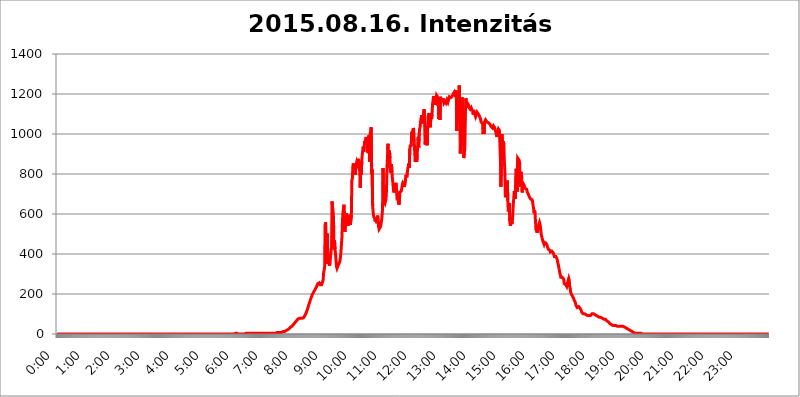
| Category | 2015.08.16. Intenzitás [W/m^2] |
|---|---|
| 0.0 | 0 |
| 0.0006944444444444445 | 0 |
| 0.001388888888888889 | 0 |
| 0.0020833333333333333 | 0 |
| 0.002777777777777778 | 0 |
| 0.003472222222222222 | 0 |
| 0.004166666666666667 | 0 |
| 0.004861111111111111 | 0 |
| 0.005555555555555556 | 0 |
| 0.0062499999999999995 | 0 |
| 0.006944444444444444 | 0 |
| 0.007638888888888889 | 0 |
| 0.008333333333333333 | 0 |
| 0.009027777777777779 | 0 |
| 0.009722222222222222 | 0 |
| 0.010416666666666666 | 0 |
| 0.011111111111111112 | 0 |
| 0.011805555555555555 | 0 |
| 0.012499999999999999 | 0 |
| 0.013194444444444444 | 0 |
| 0.013888888888888888 | 0 |
| 0.014583333333333332 | 0 |
| 0.015277777777777777 | 0 |
| 0.015972222222222224 | 0 |
| 0.016666666666666666 | 0 |
| 0.017361111111111112 | 0 |
| 0.018055555555555557 | 0 |
| 0.01875 | 0 |
| 0.019444444444444445 | 0 |
| 0.02013888888888889 | 0 |
| 0.020833333333333332 | 0 |
| 0.02152777777777778 | 0 |
| 0.022222222222222223 | 0 |
| 0.02291666666666667 | 0 |
| 0.02361111111111111 | 0 |
| 0.024305555555555556 | 0 |
| 0.024999999999999998 | 0 |
| 0.025694444444444447 | 0 |
| 0.02638888888888889 | 0 |
| 0.027083333333333334 | 0 |
| 0.027777777777777776 | 0 |
| 0.02847222222222222 | 0 |
| 0.029166666666666664 | 0 |
| 0.029861111111111113 | 0 |
| 0.030555555555555555 | 0 |
| 0.03125 | 0 |
| 0.03194444444444445 | 0 |
| 0.03263888888888889 | 0 |
| 0.03333333333333333 | 0 |
| 0.034027777777777775 | 0 |
| 0.034722222222222224 | 0 |
| 0.035416666666666666 | 0 |
| 0.036111111111111115 | 0 |
| 0.03680555555555556 | 0 |
| 0.0375 | 0 |
| 0.03819444444444444 | 0 |
| 0.03888888888888889 | 0 |
| 0.03958333333333333 | 0 |
| 0.04027777777777778 | 0 |
| 0.04097222222222222 | 0 |
| 0.041666666666666664 | 0 |
| 0.042361111111111106 | 0 |
| 0.04305555555555556 | 0 |
| 0.043750000000000004 | 0 |
| 0.044444444444444446 | 0 |
| 0.04513888888888889 | 0 |
| 0.04583333333333334 | 0 |
| 0.04652777777777778 | 0 |
| 0.04722222222222222 | 0 |
| 0.04791666666666666 | 0 |
| 0.04861111111111111 | 0 |
| 0.049305555555555554 | 0 |
| 0.049999999999999996 | 0 |
| 0.05069444444444445 | 0 |
| 0.051388888888888894 | 0 |
| 0.052083333333333336 | 0 |
| 0.05277777777777778 | 0 |
| 0.05347222222222222 | 0 |
| 0.05416666666666667 | 0 |
| 0.05486111111111111 | 0 |
| 0.05555555555555555 | 0 |
| 0.05625 | 0 |
| 0.05694444444444444 | 0 |
| 0.057638888888888885 | 0 |
| 0.05833333333333333 | 0 |
| 0.05902777777777778 | 0 |
| 0.059722222222222225 | 0 |
| 0.06041666666666667 | 0 |
| 0.061111111111111116 | 0 |
| 0.06180555555555556 | 0 |
| 0.0625 | 0 |
| 0.06319444444444444 | 0 |
| 0.06388888888888888 | 0 |
| 0.06458333333333334 | 0 |
| 0.06527777777777778 | 0 |
| 0.06597222222222222 | 0 |
| 0.06666666666666667 | 0 |
| 0.06736111111111111 | 0 |
| 0.06805555555555555 | 0 |
| 0.06874999999999999 | 0 |
| 0.06944444444444443 | 0 |
| 0.07013888888888889 | 0 |
| 0.07083333333333333 | 0 |
| 0.07152777777777779 | 0 |
| 0.07222222222222223 | 0 |
| 0.07291666666666667 | 0 |
| 0.07361111111111111 | 0 |
| 0.07430555555555556 | 0 |
| 0.075 | 0 |
| 0.07569444444444444 | 0 |
| 0.0763888888888889 | 0 |
| 0.07708333333333334 | 0 |
| 0.07777777777777778 | 0 |
| 0.07847222222222222 | 0 |
| 0.07916666666666666 | 0 |
| 0.0798611111111111 | 0 |
| 0.08055555555555556 | 0 |
| 0.08125 | 0 |
| 0.08194444444444444 | 0 |
| 0.08263888888888889 | 0 |
| 0.08333333333333333 | 0 |
| 0.08402777777777777 | 0 |
| 0.08472222222222221 | 0 |
| 0.08541666666666665 | 0 |
| 0.08611111111111112 | 0 |
| 0.08680555555555557 | 0 |
| 0.08750000000000001 | 0 |
| 0.08819444444444445 | 0 |
| 0.08888888888888889 | 0 |
| 0.08958333333333333 | 0 |
| 0.09027777777777778 | 0 |
| 0.09097222222222222 | 0 |
| 0.09166666666666667 | 0 |
| 0.09236111111111112 | 0 |
| 0.09305555555555556 | 0 |
| 0.09375 | 0 |
| 0.09444444444444444 | 0 |
| 0.09513888888888888 | 0 |
| 0.09583333333333333 | 0 |
| 0.09652777777777777 | 0 |
| 0.09722222222222222 | 0 |
| 0.09791666666666667 | 0 |
| 0.09861111111111111 | 0 |
| 0.09930555555555555 | 0 |
| 0.09999999999999999 | 0 |
| 0.10069444444444443 | 0 |
| 0.1013888888888889 | 0 |
| 0.10208333333333335 | 0 |
| 0.10277777777777779 | 0 |
| 0.10347222222222223 | 0 |
| 0.10416666666666667 | 0 |
| 0.10486111111111111 | 0 |
| 0.10555555555555556 | 0 |
| 0.10625 | 0 |
| 0.10694444444444444 | 0 |
| 0.1076388888888889 | 0 |
| 0.10833333333333334 | 0 |
| 0.10902777777777778 | 0 |
| 0.10972222222222222 | 0 |
| 0.1111111111111111 | 0 |
| 0.11180555555555556 | 0 |
| 0.11180555555555556 | 0 |
| 0.1125 | 0 |
| 0.11319444444444444 | 0 |
| 0.11388888888888889 | 0 |
| 0.11458333333333333 | 0 |
| 0.11527777777777777 | 0 |
| 0.11597222222222221 | 0 |
| 0.11666666666666665 | 0 |
| 0.1173611111111111 | 0 |
| 0.11805555555555557 | 0 |
| 0.11944444444444445 | 0 |
| 0.12013888888888889 | 0 |
| 0.12083333333333333 | 0 |
| 0.12152777777777778 | 0 |
| 0.12222222222222223 | 0 |
| 0.12291666666666667 | 0 |
| 0.12291666666666667 | 0 |
| 0.12361111111111112 | 0 |
| 0.12430555555555556 | 0 |
| 0.125 | 0 |
| 0.12569444444444444 | 0 |
| 0.12638888888888888 | 0 |
| 0.12708333333333333 | 0 |
| 0.16875 | 0 |
| 0.12847222222222224 | 0 |
| 0.12916666666666668 | 0 |
| 0.12986111111111112 | 0 |
| 0.13055555555555556 | 0 |
| 0.13125 | 0 |
| 0.13194444444444445 | 0 |
| 0.1326388888888889 | 0 |
| 0.13333333333333333 | 0 |
| 0.13402777777777777 | 0 |
| 0.13402777777777777 | 0 |
| 0.13472222222222222 | 0 |
| 0.13541666666666666 | 0 |
| 0.1361111111111111 | 0 |
| 0.13749999999999998 | 0 |
| 0.13819444444444443 | 0 |
| 0.1388888888888889 | 0 |
| 0.13958333333333334 | 0 |
| 0.14027777777777778 | 0 |
| 0.14097222222222222 | 0 |
| 0.14166666666666666 | 0 |
| 0.1423611111111111 | 0 |
| 0.14305555555555557 | 0 |
| 0.14375000000000002 | 0 |
| 0.14444444444444446 | 0 |
| 0.1451388888888889 | 0 |
| 0.1451388888888889 | 0 |
| 0.14652777777777778 | 0 |
| 0.14722222222222223 | 0 |
| 0.14791666666666667 | 0 |
| 0.1486111111111111 | 0 |
| 0.14930555555555555 | 0 |
| 0.15 | 0 |
| 0.15069444444444444 | 0 |
| 0.15138888888888888 | 0 |
| 0.15208333333333332 | 0 |
| 0.15277777777777776 | 0 |
| 0.15347222222222223 | 0 |
| 0.15416666666666667 | 0 |
| 0.15486111111111112 | 0 |
| 0.15555555555555556 | 0 |
| 0.15625 | 0 |
| 0.15694444444444444 | 0 |
| 0.15763888888888888 | 0 |
| 0.15833333333333333 | 0 |
| 0.15902777777777777 | 0 |
| 0.15972222222222224 | 0 |
| 0.16041666666666668 | 0 |
| 0.16111111111111112 | 0 |
| 0.16180555555555556 | 0 |
| 0.1625 | 0 |
| 0.16319444444444445 | 0 |
| 0.1638888888888889 | 0 |
| 0.16458333333333333 | 0 |
| 0.16527777777777777 | 0 |
| 0.16597222222222222 | 0 |
| 0.16666666666666666 | 0 |
| 0.1673611111111111 | 0 |
| 0.16805555555555554 | 0 |
| 0.16874999999999998 | 0 |
| 0.16944444444444443 | 0 |
| 0.17013888888888887 | 0 |
| 0.1708333333333333 | 0 |
| 0.17152777777777775 | 0 |
| 0.17222222222222225 | 0 |
| 0.1729166666666667 | 0 |
| 0.17361111111111113 | 0 |
| 0.17430555555555557 | 0 |
| 0.17500000000000002 | 0 |
| 0.17569444444444446 | 0 |
| 0.1763888888888889 | 0 |
| 0.17708333333333334 | 0 |
| 0.17777777777777778 | 0 |
| 0.17847222222222223 | 0 |
| 0.17916666666666667 | 0 |
| 0.1798611111111111 | 0 |
| 0.18055555555555555 | 0 |
| 0.18125 | 0 |
| 0.18194444444444444 | 0 |
| 0.1826388888888889 | 0 |
| 0.18333333333333335 | 0 |
| 0.1840277777777778 | 0 |
| 0.18472222222222223 | 0 |
| 0.18541666666666667 | 0 |
| 0.18611111111111112 | 0 |
| 0.18680555555555556 | 0 |
| 0.1875 | 0 |
| 0.18819444444444444 | 0 |
| 0.18888888888888888 | 0 |
| 0.18958333333333333 | 0 |
| 0.19027777777777777 | 0 |
| 0.1909722222222222 | 0 |
| 0.19166666666666665 | 0 |
| 0.19236111111111112 | 0 |
| 0.19305555555555554 | 0 |
| 0.19375 | 0 |
| 0.19444444444444445 | 0 |
| 0.1951388888888889 | 0 |
| 0.19583333333333333 | 0 |
| 0.19652777777777777 | 0 |
| 0.19722222222222222 | 0 |
| 0.19791666666666666 | 0 |
| 0.1986111111111111 | 0 |
| 0.19930555555555554 | 0 |
| 0.19999999999999998 | 0 |
| 0.20069444444444443 | 0 |
| 0.20138888888888887 | 0 |
| 0.2020833333333333 | 0 |
| 0.2027777777777778 | 0 |
| 0.2034722222222222 | 0 |
| 0.2041666666666667 | 0 |
| 0.20486111111111113 | 0 |
| 0.20555555555555557 | 0 |
| 0.20625000000000002 | 0 |
| 0.20694444444444446 | 0 |
| 0.2076388888888889 | 0 |
| 0.20833333333333334 | 0 |
| 0.20902777777777778 | 0 |
| 0.20972222222222223 | 0 |
| 0.21041666666666667 | 0 |
| 0.2111111111111111 | 0 |
| 0.21180555555555555 | 0 |
| 0.2125 | 0 |
| 0.21319444444444444 | 0 |
| 0.2138888888888889 | 0 |
| 0.21458333333333335 | 0 |
| 0.2152777777777778 | 0 |
| 0.21597222222222223 | 0 |
| 0.21666666666666667 | 0 |
| 0.21736111111111112 | 0 |
| 0.21805555555555556 | 0 |
| 0.21875 | 0 |
| 0.21944444444444444 | 0 |
| 0.22013888888888888 | 0 |
| 0.22083333333333333 | 0 |
| 0.22152777777777777 | 0 |
| 0.2222222222222222 | 0 |
| 0.22291666666666665 | 0 |
| 0.2236111111111111 | 0 |
| 0.22430555555555556 | 0 |
| 0.225 | 0 |
| 0.22569444444444445 | 0 |
| 0.2263888888888889 | 0 |
| 0.22708333333333333 | 0 |
| 0.22777777777777777 | 0 |
| 0.22847222222222222 | 0 |
| 0.22916666666666666 | 0 |
| 0.2298611111111111 | 0 |
| 0.23055555555555554 | 0 |
| 0.23124999999999998 | 0 |
| 0.23194444444444443 | 0 |
| 0.23263888888888887 | 0 |
| 0.2333333333333333 | 0 |
| 0.2340277777777778 | 0 |
| 0.2347222222222222 | 0 |
| 0.2354166666666667 | 0 |
| 0.23611111111111113 | 0 |
| 0.23680555555555557 | 0 |
| 0.23750000000000002 | 0 |
| 0.23819444444444446 | 0 |
| 0.2388888888888889 | 0 |
| 0.23958333333333334 | 0 |
| 0.24027777777777778 | 0 |
| 0.24097222222222223 | 0 |
| 0.24166666666666667 | 0 |
| 0.2423611111111111 | 0 |
| 0.24305555555555555 | 0 |
| 0.24375 | 0 |
| 0.24444444444444446 | 0 |
| 0.24513888888888888 | 0 |
| 0.24583333333333335 | 0 |
| 0.2465277777777778 | 0 |
| 0.24722222222222223 | 0 |
| 0.24791666666666667 | 0 |
| 0.24861111111111112 | 0 |
| 0.24930555555555556 | 0 |
| 0.25 | 3.525 |
| 0.25069444444444444 | 3.525 |
| 0.2513888888888889 | 0 |
| 0.2520833333333333 | 3.525 |
| 0.25277777777777777 | 0 |
| 0.2534722222222222 | 0 |
| 0.25416666666666665 | 0 |
| 0.2548611111111111 | 0 |
| 0.2555555555555556 | 0 |
| 0.25625000000000003 | 0 |
| 0.2569444444444445 | 3.525 |
| 0.2576388888888889 | 0 |
| 0.25833333333333336 | 0 |
| 0.2590277777777778 | 0 |
| 0.25972222222222224 | 0 |
| 0.2604166666666667 | 0 |
| 0.2611111111111111 | 0 |
| 0.26180555555555557 | 0 |
| 0.2625 | 0 |
| 0.26319444444444445 | 0 |
| 0.2638888888888889 | 0 |
| 0.26458333333333334 | 3.525 |
| 0.2652777777777778 | 3.525 |
| 0.2659722222222222 | 3.525 |
| 0.26666666666666666 | 3.525 |
| 0.2673611111111111 | 3.525 |
| 0.26805555555555555 | 3.525 |
| 0.26875 | 3.525 |
| 0.26944444444444443 | 3.525 |
| 0.2701388888888889 | 3.525 |
| 0.2708333333333333 | 3.525 |
| 0.27152777777777776 | 3.525 |
| 0.2722222222222222 | 3.525 |
| 0.27291666666666664 | 3.525 |
| 0.2736111111111111 | 3.525 |
| 0.2743055555555555 | 3.525 |
| 0.27499999999999997 | 3.525 |
| 0.27569444444444446 | 3.525 |
| 0.27638888888888885 | 3.525 |
| 0.27708333333333335 | 3.525 |
| 0.2777777777777778 | 3.525 |
| 0.27847222222222223 | 3.525 |
| 0.2791666666666667 | 3.525 |
| 0.2798611111111111 | 3.525 |
| 0.28055555555555556 | 3.525 |
| 0.28125 | 3.525 |
| 0.28194444444444444 | 3.525 |
| 0.2826388888888889 | 3.525 |
| 0.2833333333333333 | 3.525 |
| 0.28402777777777777 | 3.525 |
| 0.2847222222222222 | 3.525 |
| 0.28541666666666665 | 3.525 |
| 0.28611111111111115 | 3.525 |
| 0.28680555555555554 | 3.525 |
| 0.28750000000000003 | 3.525 |
| 0.2881944444444445 | 3.525 |
| 0.2888888888888889 | 3.525 |
| 0.28958333333333336 | 3.525 |
| 0.2902777777777778 | 3.525 |
| 0.29097222222222224 | 3.525 |
| 0.2916666666666667 | 3.525 |
| 0.2923611111111111 | 3.525 |
| 0.29305555555555557 | 3.525 |
| 0.29375 | 3.525 |
| 0.29444444444444445 | 3.525 |
| 0.2951388888888889 | 3.525 |
| 0.29583333333333334 | 3.525 |
| 0.2965277777777778 | 3.525 |
| 0.2972222222222222 | 3.525 |
| 0.29791666666666666 | 3.525 |
| 0.2986111111111111 | 3.525 |
| 0.29930555555555555 | 3.525 |
| 0.3 | 3.525 |
| 0.30069444444444443 | 3.525 |
| 0.3013888888888889 | 3.525 |
| 0.3020833333333333 | 3.525 |
| 0.30277777777777776 | 3.525 |
| 0.3034722222222222 | 3.525 |
| 0.30416666666666664 | 3.525 |
| 0.3048611111111111 | 3.525 |
| 0.3055555555555555 | 3.525 |
| 0.30624999999999997 | 3.525 |
| 0.3069444444444444 | 3.525 |
| 0.3076388888888889 | 7.887 |
| 0.30833333333333335 | 7.887 |
| 0.3090277777777778 | 7.887 |
| 0.30972222222222223 | 7.887 |
| 0.3104166666666667 | 7.887 |
| 0.3111111111111111 | 7.887 |
| 0.31180555555555556 | 7.887 |
| 0.3125 | 7.887 |
| 0.31319444444444444 | 7.887 |
| 0.3138888888888889 | 7.887 |
| 0.3145833333333333 | 7.887 |
| 0.31527777777777777 | 7.887 |
| 0.3159722222222222 | 12.257 |
| 0.31666666666666665 | 12.257 |
| 0.31736111111111115 | 12.257 |
| 0.31805555555555554 | 12.257 |
| 0.31875000000000003 | 12.257 |
| 0.3194444444444445 | 12.257 |
| 0.3201388888888889 | 16.636 |
| 0.32083333333333336 | 16.636 |
| 0.3215277777777778 | 21.024 |
| 0.32222222222222224 | 21.024 |
| 0.3229166666666667 | 21.024 |
| 0.3236111111111111 | 21.024 |
| 0.32430555555555557 | 25.419 |
| 0.325 | 25.419 |
| 0.32569444444444445 | 29.823 |
| 0.3263888888888889 | 29.823 |
| 0.32708333333333334 | 34.234 |
| 0.3277777777777778 | 34.234 |
| 0.3284722222222222 | 38.653 |
| 0.32916666666666666 | 38.653 |
| 0.3298611111111111 | 38.653 |
| 0.33055555555555555 | 43.079 |
| 0.33125 | 47.511 |
| 0.33194444444444443 | 47.511 |
| 0.3326388888888889 | 51.951 |
| 0.3333333333333333 | 56.398 |
| 0.3340277777777778 | 60.85 |
| 0.3347222222222222 | 60.85 |
| 0.3354166666666667 | 65.31 |
| 0.3361111111111111 | 65.31 |
| 0.3368055555555556 | 69.775 |
| 0.33749999999999997 | 74.246 |
| 0.33819444444444446 | 74.246 |
| 0.33888888888888885 | 78.722 |
| 0.33958333333333335 | 78.722 |
| 0.34027777777777773 | 78.722 |
| 0.34097222222222223 | 78.722 |
| 0.3416666666666666 | 78.722 |
| 0.3423611111111111 | 78.722 |
| 0.3430555555555555 | 78.722 |
| 0.34375 | 78.722 |
| 0.3444444444444445 | 78.722 |
| 0.3451388888888889 | 83.205 |
| 0.3458333333333334 | 83.205 |
| 0.34652777777777777 | 87.692 |
| 0.34722222222222227 | 92.184 |
| 0.34791666666666665 | 96.682 |
| 0.34861111111111115 | 101.184 |
| 0.34930555555555554 | 105.69 |
| 0.35000000000000003 | 114.716 |
| 0.3506944444444444 | 119.235 |
| 0.3513888888888889 | 128.284 |
| 0.3520833333333333 | 137.347 |
| 0.3527777777777778 | 146.423 |
| 0.3534722222222222 | 150.964 |
| 0.3541666666666667 | 160.056 |
| 0.3548611111111111 | 169.156 |
| 0.35555555555555557 | 173.709 |
| 0.35625 | 182.82 |
| 0.35694444444444445 | 187.378 |
| 0.3576388888888889 | 196.497 |
| 0.35833333333333334 | 201.058 |
| 0.3590277777777778 | 205.62 |
| 0.3597222222222222 | 210.182 |
| 0.36041666666666666 | 214.746 |
| 0.3611111111111111 | 219.309 |
| 0.36180555555555555 | 219.309 |
| 0.3625 | 228.436 |
| 0.36319444444444443 | 233 |
| 0.3638888888888889 | 237.564 |
| 0.3645833333333333 | 242.127 |
| 0.3652777777777778 | 251.251 |
| 0.3659722222222222 | 251.251 |
| 0.3666666666666667 | 255.813 |
| 0.3673611111111111 | 255.813 |
| 0.3680555555555556 | 251.251 |
| 0.36874999999999997 | 246.689 |
| 0.36944444444444446 | 246.689 |
| 0.37013888888888885 | 246.689 |
| 0.37083333333333335 | 246.689 |
| 0.37152777777777773 | 255.813 |
| 0.37222222222222223 | 260.373 |
| 0.3729166666666666 | 269.49 |
| 0.3736111111111111 | 305.898 |
| 0.3743055555555555 | 310.44 |
| 0.375 | 333.113 |
| 0.3756944444444445 | 545.416 |
| 0.3763888888888889 | 558.261 |
| 0.3770833333333334 | 382.715 |
| 0.37777777777777777 | 351.198 |
| 0.37847222222222227 | 502.192 |
| 0.37916666666666665 | 431.833 |
| 0.37986111111111115 | 396.164 |
| 0.38055555555555554 | 355.712 |
| 0.38125000000000003 | 360.221 |
| 0.3819444444444444 | 342.162 |
| 0.3826388888888889 | 360.221 |
| 0.3833333333333333 | 391.685 |
| 0.3840277777777778 | 396.164 |
| 0.3847222222222222 | 436.27 |
| 0.3854166666666667 | 663.019 |
| 0.3861111111111111 | 634.105 |
| 0.38680555555555557 | 617.436 |
| 0.3875 | 575.299 |
| 0.38819444444444445 | 422.943 |
| 0.3888888888888889 | 467.187 |
| 0.38958333333333334 | 422.943 |
| 0.3902777777777778 | 400.638 |
| 0.3909722222222222 | 369.23 |
| 0.39166666666666666 | 337.639 |
| 0.3923611111111111 | 328.584 |
| 0.39305555555555555 | 333.113 |
| 0.39375 | 342.162 |
| 0.39444444444444443 | 346.682 |
| 0.3951388888888889 | 351.198 |
| 0.3958333333333333 | 355.712 |
| 0.3965277777777778 | 364.728 |
| 0.3972222222222222 | 387.202 |
| 0.3979166666666667 | 409.574 |
| 0.3986111111111111 | 449.551 |
| 0.3993055555555556 | 484.735 |
| 0.39999999999999997 | 562.53 |
| 0.40069444444444446 | 609.062 |
| 0.40138888888888885 | 621.613 |
| 0.40208333333333335 | 646.537 |
| 0.40277777777777773 | 562.53 |
| 0.40347222222222223 | 510.885 |
| 0.4041666666666666 | 515.223 |
| 0.4048611111111111 | 592.233 |
| 0.4055555555555555 | 604.864 |
| 0.40625 | 549.704 |
| 0.4069444444444445 | 571.049 |
| 0.4076388888888889 | 541.121 |
| 0.4083333333333334 | 575.299 |
| 0.40902777777777777 | 571.049 |
| 0.40972222222222227 | 596.45 |
| 0.41041666666666665 | 553.986 |
| 0.41111111111111115 | 545.416 |
| 0.41180555555555554 | 549.704 |
| 0.41250000000000003 | 596.45 |
| 0.4131944444444444 | 767.62 |
| 0.4138888888888889 | 775.492 |
| 0.4145833333333333 | 837.682 |
| 0.4152777777777778 | 853.029 |
| 0.4159722222222222 | 849.199 |
| 0.4166666666666667 | 806.757 |
| 0.4173611111111111 | 814.519 |
| 0.41805555555555557 | 795.074 |
| 0.41875 | 837.682 |
| 0.41944444444444445 | 849.199 |
| 0.4201388888888889 | 860.676 |
| 0.42083333333333334 | 853.029 |
| 0.4215277777777778 | 856.855 |
| 0.4222222222222222 | 875.918 |
| 0.42291666666666666 | 875.918 |
| 0.4236111111111111 | 837.682 |
| 0.42430555555555555 | 806.757 |
| 0.425 | 731.896 |
| 0.42569444444444443 | 829.981 |
| 0.4263888888888889 | 795.074 |
| 0.4270833333333333 | 864.493 |
| 0.4277777777777778 | 898.668 |
| 0.4284722222222222 | 902.447 |
| 0.4291666666666667 | 936.33 |
| 0.4298611111111111 | 909.996 |
| 0.4305555555555556 | 936.33 |
| 0.43124999999999997 | 966.295 |
| 0.43194444444444446 | 958.814 |
| 0.43263888888888885 | 962.555 |
| 0.43333333333333335 | 984.98 |
| 0.43402777777777773 | 973.772 |
| 0.43472222222222223 | 951.327 |
| 0.4354166666666666 | 906.223 |
| 0.4361111111111111 | 906.223 |
| 0.4368055555555555 | 992.448 |
| 0.4375 | 992.448 |
| 0.4381944444444445 | 860.676 |
| 0.4388888888888889 | 1003.65 |
| 0.4395833333333334 | 1011.118 |
| 0.44027777777777777 | 1033.537 |
| 0.44097222222222227 | 798.974 |
| 0.44166666666666665 | 822.26 |
| 0.44236111111111115 | 642.4 |
| 0.44305555555555554 | 609.062 |
| 0.44375000000000003 | 588.009 |
| 0.4444444444444444 | 592.233 |
| 0.4451388888888889 | 579.542 |
| 0.4458333333333333 | 562.53 |
| 0.4465277777777778 | 566.793 |
| 0.4472222222222222 | 579.542 |
| 0.4479166666666667 | 553.986 |
| 0.4486111111111111 | 562.53 |
| 0.44930555555555557 | 592.233 |
| 0.45 | 566.793 |
| 0.45069444444444445 | 536.82 |
| 0.4513888888888889 | 523.88 |
| 0.45208333333333334 | 523.88 |
| 0.4527777777777778 | 528.2 |
| 0.4534722222222222 | 536.82 |
| 0.45416666666666666 | 549.704 |
| 0.4548611111111111 | 566.793 |
| 0.45555555555555555 | 592.233 |
| 0.45625 | 625.784 |
| 0.45694444444444443 | 829.981 |
| 0.4576388888888889 | 646.537 |
| 0.4583333333333333 | 667.123 |
| 0.4590277777777778 | 671.22 |
| 0.4597222222222222 | 654.791 |
| 0.4604166666666667 | 654.791 |
| 0.4611111111111111 | 675.311 |
| 0.4618055555555556 | 719.877 |
| 0.46249999999999997 | 837.682 |
| 0.46319444444444446 | 883.516 |
| 0.46388888888888885 | 951.327 |
| 0.46458333333333335 | 829.981 |
| 0.46527777777777773 | 906.223 |
| 0.46597222222222223 | 917.534 |
| 0.4666666666666666 | 879.719 |
| 0.4673611111111111 | 806.757 |
| 0.4680555555555555 | 818.392 |
| 0.46875 | 849.199 |
| 0.4694444444444445 | 810.641 |
| 0.4701388888888889 | 775.492 |
| 0.4708333333333334 | 751.803 |
| 0.47152777777777777 | 719.877 |
| 0.47222222222222227 | 707.8 |
| 0.47291666666666665 | 719.877 |
| 0.47361111111111115 | 739.877 |
| 0.47430555555555554 | 731.896 |
| 0.47500000000000003 | 755.766 |
| 0.4756944444444444 | 719.877 |
| 0.4763888888888889 | 687.544 |
| 0.4770833333333333 | 691.608 |
| 0.4777777777777778 | 695.666 |
| 0.4784722222222222 | 658.909 |
| 0.4791666666666667 | 646.537 |
| 0.4798611111111111 | 658.909 |
| 0.48055555555555557 | 707.8 |
| 0.48125 | 703.762 |
| 0.48194444444444445 | 707.8 |
| 0.4826388888888889 | 715.858 |
| 0.48333333333333334 | 719.877 |
| 0.4840277777777778 | 747.834 |
| 0.4847222222222222 | 755.766 |
| 0.48541666666666666 | 751.803 |
| 0.4861111111111111 | 747.834 |
| 0.48680555555555555 | 735.89 |
| 0.4875 | 743.859 |
| 0.48819444444444443 | 759.723 |
| 0.4888888888888889 | 795.074 |
| 0.4895833333333333 | 795.074 |
| 0.4902777777777778 | 783.342 |
| 0.4909722222222222 | 806.757 |
| 0.4916666666666667 | 826.123 |
| 0.4923611111111111 | 837.682 |
| 0.4930555555555556 | 853.029 |
| 0.49374999999999997 | 829.981 |
| 0.49444444444444446 | 925.06 |
| 0.49513888888888885 | 943.832 |
| 0.49583333333333335 | 936.33 |
| 0.49652777777777773 | 951.327 |
| 0.49722222222222223 | 1011.118 |
| 0.4979166666666666 | 981.244 |
| 0.4986111111111111 | 1014.852 |
| 0.4993055555555555 | 1029.798 |
| 0.5 | 1022.323 |
| 0.5006944444444444 | 962.555 |
| 0.5013888888888889 | 902.447 |
| 0.5020833333333333 | 860.676 |
| 0.5027777777777778 | 883.516 |
| 0.5034722222222222 | 883.516 |
| 0.5041666666666667 | 860.676 |
| 0.5048611111111111 | 894.885 |
| 0.5055555555555555 | 947.58 |
| 0.50625 | 984.98 |
| 0.5069444444444444 | 932.576 |
| 0.5076388888888889 | 999.916 |
| 0.5083333333333333 | 1026.06 |
| 0.5090277777777777 | 1037.277 |
| 0.5097222222222222 | 1067.267 |
| 0.5104166666666666 | 1063.51 |
| 0.5111111111111112 | 1093.653 |
| 0.5118055555555555 | 1052.255 |
| 0.5125000000000001 | 1048.508 |
| 0.5131944444444444 | 1074.789 |
| 0.513888888888889 | 1108.816 |
| 0.5145833333333333 | 1124.056 |
| 0.5152777777777778 | 1052.255 |
| 0.5159722222222222 | 947.58 |
| 0.5166666666666667 | 977.508 |
| 0.517361111111111 | 992.448 |
| 0.5180555555555556 | 1037.277 |
| 0.5187499999999999 | 943.832 |
| 0.5194444444444445 | 1022.323 |
| 0.5201388888888888 | 1086.097 |
| 0.5208333333333334 | 1082.324 |
| 0.5215277777777778 | 1105.019 |
| 0.5222222222222223 | 1105.019 |
| 0.5229166666666667 | 1033.537 |
| 0.5236111111111111 | 1056.004 |
| 0.5243055555555556 | 1101.226 |
| 0.525 | 1074.789 |
| 0.5256944444444445 | 1101.226 |
| 0.5263888888888889 | 1150.946 |
| 0.5270833333333333 | 1166.46 |
| 0.5277777777777778 | 1189.969 |
| 0.5284722222222222 | 1147.086 |
| 0.5291666666666667 | 1162.571 |
| 0.5298611111111111 | 1147.086 |
| 0.5305555555555556 | 1154.814 |
| 0.53125 | 1178.177 |
| 0.5319444444444444 | 1193.918 |
| 0.5326388888888889 | 1193.918 |
| 0.5333333333333333 | 1186.03 |
| 0.5340277777777778 | 1139.384 |
| 0.5347222222222222 | 1147.086 |
| 0.5354166666666667 | 1074.789 |
| 0.5361111111111111 | 1112.618 |
| 0.5368055555555555 | 1071.027 |
| 0.5375 | 1186.03 |
| 0.5381944444444444 | 1166.46 |
| 0.5388888888888889 | 1162.571 |
| 0.5395833333333333 | 1170.358 |
| 0.5402777777777777 | 1166.46 |
| 0.5409722222222222 | 1178.177 |
| 0.5416666666666666 | 1170.358 |
| 0.5423611111111112 | 1154.814 |
| 0.5430555555555555 | 1158.689 |
| 0.5437500000000001 | 1162.571 |
| 0.5444444444444444 | 1158.689 |
| 0.545138888888889 | 1154.814 |
| 0.5458333333333333 | 1154.814 |
| 0.5465277777777778 | 1170.358 |
| 0.5472222222222222 | 1174.263 |
| 0.5479166666666667 | 1158.689 |
| 0.548611111111111 | 1154.814 |
| 0.5493055555555556 | 1162.571 |
| 0.5499999999999999 | 1186.03 |
| 0.5506944444444445 | 1186.03 |
| 0.5513888888888888 | 1182.099 |
| 0.5520833333333334 | 1182.099 |
| 0.5527777777777778 | 1182.099 |
| 0.5534722222222223 | 1186.03 |
| 0.5541666666666667 | 1189.969 |
| 0.5548611111111111 | 1193.918 |
| 0.5555555555555556 | 1201.843 |
| 0.55625 | 1201.843 |
| 0.5569444444444445 | 1209.807 |
| 0.5576388888888889 | 1201.843 |
| 0.5583333333333333 | 1205.82 |
| 0.5590277777777778 | 1201.843 |
| 0.5597222222222222 | 1217.812 |
| 0.5604166666666667 | 1014.852 |
| 0.5611111111111111 | 1178.177 |
| 0.5618055555555556 | 1105.019 |
| 0.5625 | 1105.019 |
| 0.5631944444444444 | 1059.756 |
| 0.5638888888888889 | 1242.089 |
| 0.5645833333333333 | 1131.708 |
| 0.5652777777777778 | 902.447 |
| 0.5659722222222222 | 977.508 |
| 0.5666666666666667 | 1127.879 |
| 0.5673611111111111 | 1116.426 |
| 0.5680555555555555 | 1182.099 |
| 0.56875 | 1086.097 |
| 0.5694444444444444 | 1022.323 |
| 0.5701388888888889 | 879.719 |
| 0.5708333333333333 | 906.223 |
| 0.5715277777777777 | 921.298 |
| 0.5722222222222222 | 1044.762 |
| 0.5729166666666666 | 1178.177 |
| 0.5736111111111112 | 1170.358 |
| 0.5743055555555555 | 1154.814 |
| 0.5750000000000001 | 1158.689 |
| 0.5756944444444444 | 1147.086 |
| 0.576388888888889 | 1131.708 |
| 0.5770833333333333 | 1139.384 |
| 0.5777777777777778 | 1131.708 |
| 0.5784722222222222 | 1135.543 |
| 0.5791666666666667 | 1124.056 |
| 0.579861111111111 | 1124.056 |
| 0.5805555555555556 | 1131.708 |
| 0.5812499999999999 | 1124.056 |
| 0.5819444444444445 | 1120.238 |
| 0.5826388888888888 | 1116.426 |
| 0.5833333333333334 | 1097.437 |
| 0.5840277777777778 | 1120.238 |
| 0.5847222222222223 | 1108.816 |
| 0.5854166666666667 | 1105.019 |
| 0.5861111111111111 | 1093.653 |
| 0.5868055555555556 | 1086.097 |
| 0.5875 | 1089.873 |
| 0.5881944444444445 | 1101.226 |
| 0.5888888888888889 | 1108.816 |
| 0.5895833333333333 | 1105.019 |
| 0.5902777777777778 | 1101.226 |
| 0.5909722222222222 | 1097.437 |
| 0.5916666666666667 | 1093.653 |
| 0.5923611111111111 | 1093.653 |
| 0.5930555555555556 | 1089.873 |
| 0.59375 | 1074.789 |
| 0.5944444444444444 | 1059.756 |
| 0.5951388888888889 | 1063.51 |
| 0.5958333333333333 | 1059.756 |
| 0.5965277777777778 | 1052.255 |
| 0.5972222222222222 | 999.916 |
| 0.5979166666666667 | 1022.323 |
| 0.5986111111111111 | 999.916 |
| 0.5993055555555555 | 1059.756 |
| 0.6 | 1063.51 |
| 0.6006944444444444 | 1071.027 |
| 0.6013888888888889 | 1067.267 |
| 0.6020833333333333 | 1067.267 |
| 0.6027777777777777 | 1059.756 |
| 0.6034722222222222 | 1056.004 |
| 0.6041666666666666 | 1063.51 |
| 0.6048611111111112 | 1056.004 |
| 0.6055555555555555 | 1056.004 |
| 0.6062500000000001 | 1052.255 |
| 0.6069444444444444 | 1048.508 |
| 0.607638888888889 | 1048.508 |
| 0.6083333333333333 | 1037.277 |
| 0.6090277777777778 | 1041.019 |
| 0.6097222222222222 | 1037.277 |
| 0.6104166666666667 | 1029.798 |
| 0.611111111111111 | 1026.06 |
| 0.6118055555555556 | 1041.019 |
| 0.6124999999999999 | 1037.277 |
| 0.6131944444444445 | 1033.537 |
| 0.6138888888888888 | 1026.06 |
| 0.6145833333333334 | 1022.323 |
| 0.6152777777777778 | 1026.06 |
| 0.6159722222222223 | 996.182 |
| 0.6166666666666667 | 984.98 |
| 0.6173611111111111 | 1011.118 |
| 0.6180555555555556 | 1011.118 |
| 0.61875 | 1026.06 |
| 0.6194444444444445 | 1026.06 |
| 0.6201388888888889 | 1018.587 |
| 0.6208333333333333 | 1022.323 |
| 0.6215277777777778 | 879.719 |
| 0.6222222222222222 | 735.89 |
| 0.6229166666666667 | 845.365 |
| 0.6236111111111111 | 999.916 |
| 0.6243055555555556 | 996.182 |
| 0.625 | 940.082 |
| 0.6256944444444444 | 962.555 |
| 0.6263888888888889 | 947.58 |
| 0.6270833333333333 | 860.676 |
| 0.6277777777777778 | 814.519 |
| 0.6284722222222222 | 683.473 |
| 0.6291666666666667 | 679.395 |
| 0.6298611111111111 | 715.858 |
| 0.6305555555555555 | 723.889 |
| 0.63125 | 767.62 |
| 0.6319444444444444 | 667.123 |
| 0.6326388888888889 | 613.252 |
| 0.6333333333333333 | 629.948 |
| 0.6340277777777777 | 654.791 |
| 0.6347222222222222 | 566.793 |
| 0.6354166666666666 | 541.121 |
| 0.6361111111111112 | 541.121 |
| 0.6368055555555555 | 562.53 |
| 0.6375000000000001 | 549.704 |
| 0.6381944444444444 | 562.53 |
| 0.638888888888889 | 596.45 |
| 0.6395833333333333 | 646.537 |
| 0.6402777777777778 | 646.537 |
| 0.6409722222222222 | 715.858 |
| 0.6416666666666667 | 707.8 |
| 0.642361111111111 | 675.311 |
| 0.6430555555555556 | 679.395 |
| 0.6437499999999999 | 826.123 |
| 0.6444444444444445 | 798.974 |
| 0.6451388888888888 | 711.832 |
| 0.6458333333333334 | 879.719 |
| 0.6465277777777778 | 879.719 |
| 0.6472222222222223 | 879.719 |
| 0.6479166666666667 | 868.305 |
| 0.6486111111111111 | 853.029 |
| 0.6493055555555556 | 735.89 |
| 0.65 | 751.803 |
| 0.6506944444444445 | 810.641 |
| 0.6513888888888889 | 783.342 |
| 0.6520833333333333 | 707.8 |
| 0.6527777777777778 | 755.766 |
| 0.6534722222222222 | 755.766 |
| 0.6541666666666667 | 751.803 |
| 0.6548611111111111 | 743.859 |
| 0.6555555555555556 | 735.89 |
| 0.65625 | 727.896 |
| 0.6569444444444444 | 727.896 |
| 0.6576388888888889 | 727.896 |
| 0.6583333333333333 | 723.889 |
| 0.6590277777777778 | 711.832 |
| 0.6597222222222222 | 711.832 |
| 0.6604166666666667 | 707.8 |
| 0.6611111111111111 | 695.666 |
| 0.6618055555555555 | 687.544 |
| 0.6625 | 683.473 |
| 0.6631944444444444 | 687.544 |
| 0.6638888888888889 | 675.311 |
| 0.6645833333333333 | 675.311 |
| 0.6652777777777777 | 675.311 |
| 0.6659722222222222 | 671.22 |
| 0.6666666666666666 | 663.019 |
| 0.6673611111111111 | 642.4 |
| 0.6680555555555556 | 629.948 |
| 0.6687500000000001 | 604.864 |
| 0.6694444444444444 | 617.436 |
| 0.6701388888888888 | 600.661 |
| 0.6708333333333334 | 558.261 |
| 0.6715277777777778 | 519.555 |
| 0.6722222222222222 | 528.2 |
| 0.6729166666666666 | 506.542 |
| 0.6736111111111112 | 515.223 |
| 0.6743055555555556 | 532.513 |
| 0.6749999999999999 | 541.121 |
| 0.6756944444444444 | 549.704 |
| 0.6763888888888889 | 558.261 |
| 0.6770833333333334 | 549.704 |
| 0.6777777777777777 | 532.513 |
| 0.6784722222222223 | 506.542 |
| 0.6791666666666667 | 493.475 |
| 0.6798611111111111 | 489.108 |
| 0.6805555555555555 | 471.582 |
| 0.68125 | 462.786 |
| 0.6819444444444445 | 458.38 |
| 0.6826388888888889 | 449.551 |
| 0.6833333333333332 | 458.38 |
| 0.6840277777777778 | 458.38 |
| 0.6847222222222222 | 458.38 |
| 0.6854166666666667 | 453.968 |
| 0.686111111111111 | 449.551 |
| 0.6868055555555556 | 445.129 |
| 0.6875 | 436.27 |
| 0.6881944444444444 | 431.833 |
| 0.688888888888889 | 422.943 |
| 0.6895833333333333 | 418.492 |
| 0.6902777777777778 | 418.492 |
| 0.6909722222222222 | 418.492 |
| 0.6916666666666668 | 409.574 |
| 0.6923611111111111 | 409.574 |
| 0.6930555555555555 | 414.035 |
| 0.69375 | 414.035 |
| 0.6944444444444445 | 414.035 |
| 0.6951388888888889 | 409.574 |
| 0.6958333333333333 | 405.108 |
| 0.6965277777777777 | 396.164 |
| 0.6972222222222223 | 387.202 |
| 0.6979166666666666 | 382.715 |
| 0.6986111111111111 | 387.202 |
| 0.6993055555555556 | 387.202 |
| 0.7000000000000001 | 382.715 |
| 0.7006944444444444 | 378.224 |
| 0.7013888888888888 | 369.23 |
| 0.7020833333333334 | 355.712 |
| 0.7027777777777778 | 346.682 |
| 0.7034722222222222 | 333.113 |
| 0.7041666666666666 | 319.517 |
| 0.7048611111111112 | 305.898 |
| 0.7055555555555556 | 296.808 |
| 0.7062499999999999 | 283.156 |
| 0.7069444444444444 | 278.603 |
| 0.7076388888888889 | 278.603 |
| 0.7083333333333334 | 283.156 |
| 0.7090277777777777 | 287.709 |
| 0.7097222222222223 | 287.709 |
| 0.7104166666666667 | 274.047 |
| 0.7111111111111111 | 251.251 |
| 0.7118055555555555 | 246.689 |
| 0.7125 | 251.251 |
| 0.7131944444444445 | 246.689 |
| 0.7138888888888889 | 242.127 |
| 0.7145833333333332 | 237.564 |
| 0.7152777777777778 | 242.127 |
| 0.7159722222222222 | 242.127 |
| 0.7166666666666667 | 269.49 |
| 0.717361111111111 | 278.603 |
| 0.7180555555555556 | 269.49 |
| 0.71875 | 237.564 |
| 0.7194444444444444 | 228.436 |
| 0.720138888888889 | 205.62 |
| 0.7208333333333333 | 201.058 |
| 0.7215277777777778 | 196.497 |
| 0.7222222222222222 | 191.937 |
| 0.7229166666666668 | 187.378 |
| 0.7236111111111111 | 182.82 |
| 0.7243055555555555 | 178.264 |
| 0.725 | 169.156 |
| 0.7256944444444445 | 164.605 |
| 0.7263888888888889 | 160.056 |
| 0.7270833333333333 | 150.964 |
| 0.7277777777777777 | 141.884 |
| 0.7284722222222223 | 137.347 |
| 0.7291666666666666 | 132.814 |
| 0.7298611111111111 | 132.814 |
| 0.7305555555555556 | 132.814 |
| 0.7312500000000001 | 137.347 |
| 0.7319444444444444 | 137.347 |
| 0.7326388888888888 | 132.814 |
| 0.7333333333333334 | 128.284 |
| 0.7340277777777778 | 123.758 |
| 0.7347222222222222 | 119.235 |
| 0.7354166666666666 | 110.201 |
| 0.7361111111111112 | 110.201 |
| 0.7368055555555556 | 105.69 |
| 0.7374999999999999 | 101.184 |
| 0.7381944444444444 | 101.184 |
| 0.7388888888888889 | 101.184 |
| 0.7395833333333334 | 101.184 |
| 0.7402777777777777 | 101.184 |
| 0.7409722222222223 | 96.682 |
| 0.7416666666666667 | 96.682 |
| 0.7423611111111111 | 92.184 |
| 0.7430555555555555 | 92.184 |
| 0.74375 | 92.184 |
| 0.7444444444444445 | 92.184 |
| 0.7451388888888889 | 92.184 |
| 0.7458333333333332 | 92.184 |
| 0.7465277777777778 | 92.184 |
| 0.7472222222222222 | 92.184 |
| 0.7479166666666667 | 92.184 |
| 0.748611111111111 | 92.184 |
| 0.7493055555555556 | 96.682 |
| 0.75 | 101.184 |
| 0.7506944444444444 | 101.184 |
| 0.751388888888889 | 101.184 |
| 0.7520833333333333 | 101.184 |
| 0.7527777777777778 | 96.682 |
| 0.7534722222222222 | 96.682 |
| 0.7541666666666668 | 96.682 |
| 0.7548611111111111 | 96.682 |
| 0.7555555555555555 | 92.184 |
| 0.75625 | 92.184 |
| 0.7569444444444445 | 92.184 |
| 0.7576388888888889 | 87.692 |
| 0.7583333333333333 | 87.692 |
| 0.7590277777777777 | 83.205 |
| 0.7597222222222223 | 83.205 |
| 0.7604166666666666 | 83.205 |
| 0.7611111111111111 | 83.205 |
| 0.7618055555555556 | 83.205 |
| 0.7625000000000001 | 83.205 |
| 0.7631944444444444 | 83.205 |
| 0.7638888888888888 | 78.722 |
| 0.7645833333333334 | 78.722 |
| 0.7652777777777778 | 74.246 |
| 0.7659722222222222 | 74.246 |
| 0.7666666666666666 | 74.246 |
| 0.7673611111111112 | 74.246 |
| 0.7680555555555556 | 74.246 |
| 0.7687499999999999 | 74.246 |
| 0.7694444444444444 | 69.775 |
| 0.7701388888888889 | 69.775 |
| 0.7708333333333334 | 65.31 |
| 0.7715277777777777 | 65.31 |
| 0.7722222222222223 | 60.85 |
| 0.7729166666666667 | 60.85 |
| 0.7736111111111111 | 56.398 |
| 0.7743055555555555 | 56.398 |
| 0.775 | 51.951 |
| 0.7756944444444445 | 51.951 |
| 0.7763888888888889 | 47.511 |
| 0.7770833333333332 | 47.511 |
| 0.7777777777777778 | 47.511 |
| 0.7784722222222222 | 47.511 |
| 0.7791666666666667 | 43.079 |
| 0.779861111111111 | 43.079 |
| 0.7805555555555556 | 43.079 |
| 0.78125 | 43.079 |
| 0.7819444444444444 | 43.079 |
| 0.782638888888889 | 43.079 |
| 0.7833333333333333 | 43.079 |
| 0.7840277777777778 | 38.653 |
| 0.7847222222222222 | 38.653 |
| 0.7854166666666668 | 38.653 |
| 0.7861111111111111 | 38.653 |
| 0.7868055555555555 | 38.653 |
| 0.7875 | 38.653 |
| 0.7881944444444445 | 38.653 |
| 0.7888888888888889 | 38.653 |
| 0.7895833333333333 | 38.653 |
| 0.7902777777777777 | 38.653 |
| 0.7909722222222223 | 38.653 |
| 0.7916666666666666 | 38.653 |
| 0.7923611111111111 | 38.653 |
| 0.7930555555555556 | 38.653 |
| 0.7937500000000001 | 38.653 |
| 0.7944444444444444 | 34.234 |
| 0.7951388888888888 | 34.234 |
| 0.7958333333333334 | 34.234 |
| 0.7965277777777778 | 34.234 |
| 0.7972222222222222 | 29.823 |
| 0.7979166666666666 | 29.823 |
| 0.7986111111111112 | 29.823 |
| 0.7993055555555556 | 29.823 |
| 0.7999999999999999 | 25.419 |
| 0.8006944444444444 | 25.419 |
| 0.8013888888888889 | 25.419 |
| 0.8020833333333334 | 21.024 |
| 0.8027777777777777 | 21.024 |
| 0.8034722222222223 | 16.636 |
| 0.8041666666666667 | 16.636 |
| 0.8048611111111111 | 16.636 |
| 0.8055555555555555 | 12.257 |
| 0.80625 | 12.257 |
| 0.8069444444444445 | 12.257 |
| 0.8076388888888889 | 7.887 |
| 0.8083333333333332 | 7.887 |
| 0.8090277777777778 | 7.887 |
| 0.8097222222222222 | 7.887 |
| 0.8104166666666667 | 3.525 |
| 0.811111111111111 | 3.525 |
| 0.8118055555555556 | 3.525 |
| 0.8125 | 3.525 |
| 0.8131944444444444 | 3.525 |
| 0.813888888888889 | 3.525 |
| 0.8145833333333333 | 3.525 |
| 0.8152777777777778 | 3.525 |
| 0.8159722222222222 | 3.525 |
| 0.8166666666666668 | 3.525 |
| 0.8173611111111111 | 3.525 |
| 0.8180555555555555 | 3.525 |
| 0.81875 | 3.525 |
| 0.8194444444444445 | 0 |
| 0.8201388888888889 | 0 |
| 0.8208333333333333 | 0 |
| 0.8215277777777777 | 0 |
| 0.8222222222222223 | 0 |
| 0.8229166666666666 | 0 |
| 0.8236111111111111 | 0 |
| 0.8243055555555556 | 0 |
| 0.8250000000000001 | 0 |
| 0.8256944444444444 | 0 |
| 0.8263888888888888 | 0 |
| 0.8270833333333334 | 0 |
| 0.8277777777777778 | 0 |
| 0.8284722222222222 | 0 |
| 0.8291666666666666 | 0 |
| 0.8298611111111112 | 0 |
| 0.8305555555555556 | 0 |
| 0.8312499999999999 | 0 |
| 0.8319444444444444 | 0 |
| 0.8326388888888889 | 0 |
| 0.8333333333333334 | 0 |
| 0.8340277777777777 | 0 |
| 0.8347222222222223 | 0 |
| 0.8354166666666667 | 0 |
| 0.8361111111111111 | 0 |
| 0.8368055555555555 | 0 |
| 0.8375 | 0 |
| 0.8381944444444445 | 0 |
| 0.8388888888888889 | 0 |
| 0.8395833333333332 | 0 |
| 0.8402777777777778 | 0 |
| 0.8409722222222222 | 0 |
| 0.8416666666666667 | 0 |
| 0.842361111111111 | 0 |
| 0.8430555555555556 | 0 |
| 0.84375 | 0 |
| 0.8444444444444444 | 0 |
| 0.845138888888889 | 0 |
| 0.8458333333333333 | 0 |
| 0.8465277777777778 | 0 |
| 0.8472222222222222 | 0 |
| 0.8479166666666668 | 0 |
| 0.8486111111111111 | 0 |
| 0.8493055555555555 | 0 |
| 0.85 | 0 |
| 0.8506944444444445 | 0 |
| 0.8513888888888889 | 0 |
| 0.8520833333333333 | 0 |
| 0.8527777777777777 | 0 |
| 0.8534722222222223 | 0 |
| 0.8541666666666666 | 0 |
| 0.8548611111111111 | 0 |
| 0.8555555555555556 | 0 |
| 0.8562500000000001 | 0 |
| 0.8569444444444444 | 0 |
| 0.8576388888888888 | 0 |
| 0.8583333333333334 | 0 |
| 0.8590277777777778 | 0 |
| 0.8597222222222222 | 0 |
| 0.8604166666666666 | 0 |
| 0.8611111111111112 | 0 |
| 0.8618055555555556 | 0 |
| 0.8624999999999999 | 0 |
| 0.8631944444444444 | 0 |
| 0.8638888888888889 | 0 |
| 0.8645833333333334 | 0 |
| 0.8652777777777777 | 0 |
| 0.8659722222222223 | 0 |
| 0.8666666666666667 | 0 |
| 0.8673611111111111 | 0 |
| 0.8680555555555555 | 0 |
| 0.86875 | 0 |
| 0.8694444444444445 | 0 |
| 0.8701388888888889 | 0 |
| 0.8708333333333332 | 0 |
| 0.8715277777777778 | 0 |
| 0.8722222222222222 | 0 |
| 0.8729166666666667 | 0 |
| 0.873611111111111 | 0 |
| 0.8743055555555556 | 0 |
| 0.875 | 0 |
| 0.8756944444444444 | 0 |
| 0.876388888888889 | 0 |
| 0.8770833333333333 | 0 |
| 0.8777777777777778 | 0 |
| 0.8784722222222222 | 0 |
| 0.8791666666666668 | 0 |
| 0.8798611111111111 | 0 |
| 0.8805555555555555 | 0 |
| 0.88125 | 0 |
| 0.8819444444444445 | 0 |
| 0.8826388888888889 | 0 |
| 0.8833333333333333 | 0 |
| 0.8840277777777777 | 0 |
| 0.8847222222222223 | 0 |
| 0.8854166666666666 | 0 |
| 0.8861111111111111 | 0 |
| 0.8868055555555556 | 0 |
| 0.8875000000000001 | 0 |
| 0.8881944444444444 | 0 |
| 0.8888888888888888 | 0 |
| 0.8895833333333334 | 0 |
| 0.8902777777777778 | 0 |
| 0.8909722222222222 | 0 |
| 0.8916666666666666 | 0 |
| 0.8923611111111112 | 0 |
| 0.8930555555555556 | 0 |
| 0.8937499999999999 | 0 |
| 0.8944444444444444 | 0 |
| 0.8951388888888889 | 0 |
| 0.8958333333333334 | 0 |
| 0.8965277777777777 | 0 |
| 0.8972222222222223 | 0 |
| 0.8979166666666667 | 0 |
| 0.8986111111111111 | 0 |
| 0.8993055555555555 | 0 |
| 0.9 | 0 |
| 0.9006944444444445 | 0 |
| 0.9013888888888889 | 0 |
| 0.9020833333333332 | 0 |
| 0.9027777777777778 | 0 |
| 0.9034722222222222 | 0 |
| 0.9041666666666667 | 0 |
| 0.904861111111111 | 0 |
| 0.9055555555555556 | 0 |
| 0.90625 | 0 |
| 0.9069444444444444 | 0 |
| 0.907638888888889 | 0 |
| 0.9083333333333333 | 0 |
| 0.9090277777777778 | 0 |
| 0.9097222222222222 | 0 |
| 0.9104166666666668 | 0 |
| 0.9111111111111111 | 0 |
| 0.9118055555555555 | 0 |
| 0.9125 | 0 |
| 0.9131944444444445 | 0 |
| 0.9138888888888889 | 0 |
| 0.9145833333333333 | 0 |
| 0.9152777777777777 | 0 |
| 0.9159722222222223 | 0 |
| 0.9166666666666666 | 0 |
| 0.9173611111111111 | 0 |
| 0.9180555555555556 | 0 |
| 0.9187500000000001 | 0 |
| 0.9194444444444444 | 0 |
| 0.9201388888888888 | 0 |
| 0.9208333333333334 | 0 |
| 0.9215277777777778 | 0 |
| 0.9222222222222222 | 0 |
| 0.9229166666666666 | 0 |
| 0.9236111111111112 | 0 |
| 0.9243055555555556 | 0 |
| 0.9249999999999999 | 0 |
| 0.9256944444444444 | 0 |
| 0.9263888888888889 | 0 |
| 0.9270833333333334 | 0 |
| 0.9277777777777777 | 0 |
| 0.9284722222222223 | 0 |
| 0.9291666666666667 | 0 |
| 0.9298611111111111 | 0 |
| 0.9305555555555555 | 0 |
| 0.93125 | 0 |
| 0.9319444444444445 | 0 |
| 0.9326388888888889 | 0 |
| 0.9333333333333332 | 0 |
| 0.9340277777777778 | 0 |
| 0.9347222222222222 | 0 |
| 0.9354166666666667 | 0 |
| 0.936111111111111 | 0 |
| 0.9368055555555556 | 0 |
| 0.9375 | 0 |
| 0.9381944444444444 | 0 |
| 0.938888888888889 | 0 |
| 0.9395833333333333 | 0 |
| 0.9402777777777778 | 0 |
| 0.9409722222222222 | 0 |
| 0.9416666666666668 | 0 |
| 0.9423611111111111 | 0 |
| 0.9430555555555555 | 0 |
| 0.94375 | 0 |
| 0.9444444444444445 | 0 |
| 0.9451388888888889 | 0 |
| 0.9458333333333333 | 0 |
| 0.9465277777777777 | 0 |
| 0.9472222222222223 | 0 |
| 0.9479166666666666 | 0 |
| 0.9486111111111111 | 0 |
| 0.9493055555555556 | 0 |
| 0.9500000000000001 | 0 |
| 0.9506944444444444 | 0 |
| 0.9513888888888888 | 0 |
| 0.9520833333333334 | 0 |
| 0.9527777777777778 | 0 |
| 0.9534722222222222 | 0 |
| 0.9541666666666666 | 0 |
| 0.9548611111111112 | 0 |
| 0.9555555555555556 | 0 |
| 0.9562499999999999 | 0 |
| 0.9569444444444444 | 0 |
| 0.9576388888888889 | 0 |
| 0.9583333333333334 | 0 |
| 0.9590277777777777 | 0 |
| 0.9597222222222223 | 0 |
| 0.9604166666666667 | 0 |
| 0.9611111111111111 | 0 |
| 0.9618055555555555 | 0 |
| 0.9625 | 0 |
| 0.9631944444444445 | 0 |
| 0.9638888888888889 | 0 |
| 0.9645833333333332 | 0 |
| 0.9652777777777778 | 0 |
| 0.9659722222222222 | 0 |
| 0.9666666666666667 | 0 |
| 0.967361111111111 | 0 |
| 0.9680555555555556 | 0 |
| 0.96875 | 0 |
| 0.9694444444444444 | 0 |
| 0.970138888888889 | 0 |
| 0.9708333333333333 | 0 |
| 0.9715277777777778 | 0 |
| 0.9722222222222222 | 0 |
| 0.9729166666666668 | 0 |
| 0.9736111111111111 | 0 |
| 0.9743055555555555 | 0 |
| 0.975 | 0 |
| 0.9756944444444445 | 0 |
| 0.9763888888888889 | 0 |
| 0.9770833333333333 | 0 |
| 0.9777777777777777 | 0 |
| 0.9784722222222223 | 0 |
| 0.9791666666666666 | 0 |
| 0.9798611111111111 | 0 |
| 0.9805555555555556 | 0 |
| 0.9812500000000001 | 0 |
| 0.9819444444444444 | 0 |
| 0.9826388888888888 | 0 |
| 0.9833333333333334 | 0 |
| 0.9840277777777778 | 0 |
| 0.9847222222222222 | 0 |
| 0.9854166666666666 | 0 |
| 0.9861111111111112 | 0 |
| 0.9868055555555556 | 0 |
| 0.9874999999999999 | 0 |
| 0.9881944444444444 | 0 |
| 0.9888888888888889 | 0 |
| 0.9895833333333334 | 0 |
| 0.9902777777777777 | 0 |
| 0.9909722222222223 | 0 |
| 0.9916666666666667 | 0 |
| 0.9923611111111111 | 0 |
| 0.9930555555555555 | 0 |
| 0.99375 | 0 |
| 0.9944444444444445 | 0 |
| 0.9951388888888889 | 0 |
| 0.9958333333333332 | 0 |
| 0.9965277777777778 | 0 |
| 0.9972222222222222 | 0 |
| 0.9979166666666667 | 0 |
| 0.998611111111111 | 0 |
| 0.9993055555555556 | 0 |